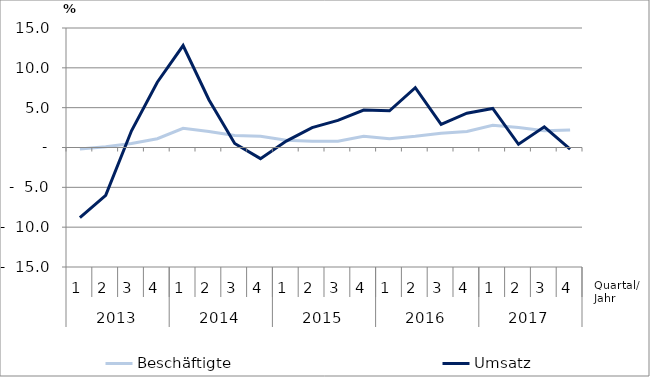
| Category | Beschäftigte | Umsatz |
|---|---|---|
| 0 | -0.2 | -8.8 |
| 1 | 0.1 | -6 |
| 2 | 0.5 | 2.1 |
| 3 | 1.1 | 8.2 |
| 4 | 2.4 | 12.8 |
| 5 | 2 | 6 |
| 6 | 1.5 | 0.5 |
| 7 | 1.4 | -1.4 |
| 8 | 0.9 | 0.8 |
| 9 | 0.8 | 2.5 |
| 10 | 0.8 | 3.4 |
| 11 | 1.4 | 4.7 |
| 12 | 1.1 | 4.6 |
| 13 | 1.4 | 7.5 |
| 14 | 1.8 | 2.9 |
| 15 | 2 | 4.3 |
| 16 | 2.8 | 4.9 |
| 17 | 2.5 | 0.4 |
| 18 | 2.1 | 2.6 |
| 19 | 2.2 | -0.2 |